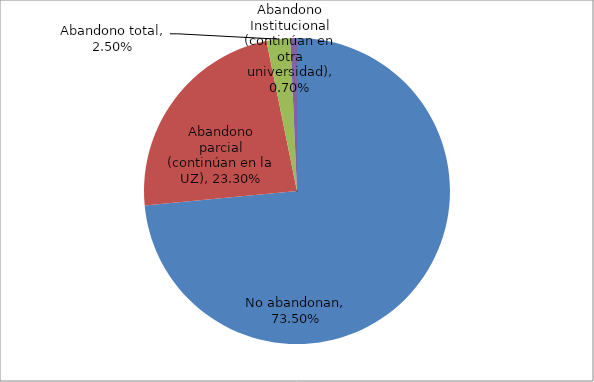
| Category | Series 0 |
|---|---|
| No abandonan | 0.735 |
| Abandono parcial (continúan en la UZ) | 0.233 |
| Abandono total | 0.025 |
| Abandono Institucional (continúan en otra universidad) | 0.007 |